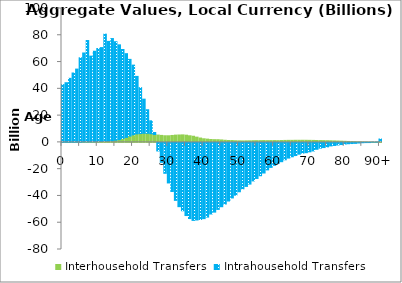
| Category | Interhousehold Transfers | Intrahousehold Transfers |
|---|---|---|
| 0 | 70.8 | 43043.864 |
|  | 80.86 | 44474.017 |
| 2 | 92.242 | 47745.673 |
| 3 | 105.069 | 51720.463 |
| 4 | 116.431 | 54624.155 |
| 5 | 122.175 | 63046.176 |
| 6 | 321.732 | 66456.096 |
| 7 | 337.242 | 75741.672 |
| 8 | 365.329 | 64052.063 |
| 9 | 431.772 | 67642.567 |
| 10 | 533.569 | 69573.166 |
| 11 | 671.576 | 70120.039 |
| 12 | 809.097 | 80018.327 |
| 13 | 996.815 | 74446.487 |
| 14 | 1223.52 | 76327.867 |
| 15 | 1611.348 | 73569.284 |
| 16 | 2056.115 | 70799.96 |
| 17 | 2861.303 | 66499.584 |
| 18 | 3737.016 | 62525.562 |
| 19 | 4776.333 | 57227.187 |
| 20 | 5628.323 | 52077.333 |
| 21 | 6353.424 | 42938.551 |
| 22 | 6604.813 | 34241.839 |
| 23 | 6790.574 | 25498.869 |
| 24 | 6810.781 | 17578.344 |
| 25 | 6463.002 | 9645.534 |
| 26 | 5878.22 | 1523.01 |
| 27 | 5470.785 | -6400.975 |
| 28 | 5209.784 | -14917.448 |
| 29 | 4947.161 | -23088.212 |
| 30 | 4938.779 | -30292.09 |
| 31 | 5169.538 | -36658.37 |
| 32 | 5421.689 | -43313.528 |
| 33 | 5519.613 | -48006.082 |
| 34 | 5603.86 | -51065.14 |
| 35 | 5378.566 | -54642.977 |
| 36 | 4935.575 | -56918.912 |
| 37 | 4597.046 | -58270.349 |
| 38 | 3912.167 | -57953.287 |
| 39 | 3249.278 | -57600.748 |
| 40 | 2700.354 | -56949.543 |
| 41 | 2443.042 | -55792.228 |
| 42 | 2161.988 | -53471.101 |
| 43 | 2026.747 | -52076.428 |
| 44 | 2000.988 | -50055.213 |
| 45 | 1830.537 | -48053.548 |
| 46 | 1581.381 | -46027.119 |
| 47 | 1421.138 | -43785.441 |
| 48 | 1380.728 | -41499.554 |
| 49 | 1236.58 | -39434.877 |
| 50 | 1161.319 | -36877.152 |
| 51 | 1092.523 | -34675.1 |
| 52 | 1142.624 | -32878.457 |
| 53 | 1168.544 | -31139.465 |
| 54 | 1244.604 | -28763.363 |
| 55 | 1285.013 | -26940.315 |
| 56 | 1279.097 | -24912.001 |
| 57 | 1350.546 | -22871.025 |
| 58 | 1288.377 | -20542.197 |
| 59 | 1315.065 | -18688.022 |
| 60 | 1340.995 | -17136.137 |
| 61 | 1301.881 | -15651.178 |
| 62 | 1381.745 | -14420.776 |
| 63 | 1464.023 | -13006.874 |
| 64 | 1517.689 | -11712.67 |
| 65 | 1515.013 | -10759.157 |
| 66 | 1565.742 | -9856.399 |
| 67 | 1565.674 | -8805.731 |
| 68 | 1577.26 | -8024.91 |
| 69 | 1564.51 | -7680.417 |
| 70 | 1524.763 | -7040.206 |
| 71 | 1475.943 | -6389.733 |
| 72 | 1426.553 | -5154.718 |
| 73 | 1351.416 | -4289.165 |
| 74 | 1307.152 | -3868.413 |
| 75 | 1260.028 | -3340.938 |
| 76 | 1181.135 | -2637.179 |
| 77 | 1103.168 | -2300.695 |
| 78 | 1010.494 | -1940.429 |
| 79 | 910.742 | -1605.901 |
| 80 | 812.414 | -1248.209 |
| 81 | 700.821 | -1004.009 |
| 82 | 596.796 | -858.054 |
| 83 | 494.931 | -727.479 |
| 84 | 406.829 | -451.021 |
| 85 | 332.518 | -247.764 |
| 86 | 268.865 | -149.99 |
| 87 | 227.263 | -134.09 |
| 88 | 204.153 | 18.568 |
| 89 | 176.335 | 60.351 |
| 90+ | 738.493 | 1765.903 |